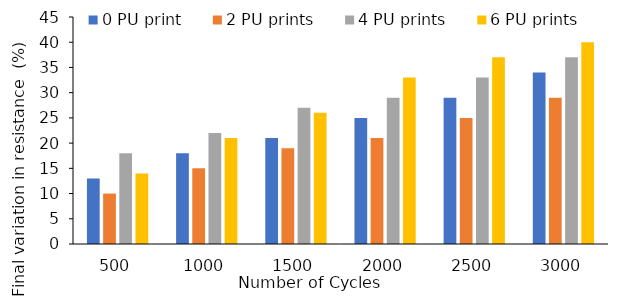
| Category | 0 PU print | 2 PU prints | 4 PU prints | 6 PU prints |
|---|---|---|---|---|
| 500.0 | 13 | 10 | 18 | 14 |
| 1000.0 | 18 | 15 | 22 | 21 |
| 1500.0 | 21 | 19 | 27 | 26 |
| 2000.0 | 25 | 21 | 29 | 33 |
| 2500.0 | 29 | 25 | 33 | 37 |
| 3000.0 | 34 | 29 | 37 | 40 |